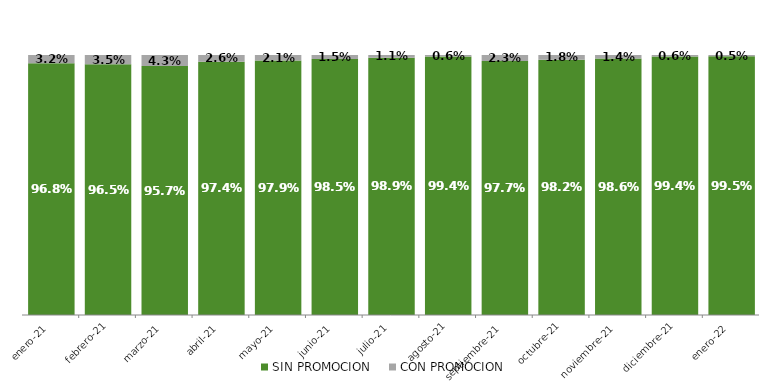
| Category | SIN PROMOCION   | CON PROMOCION   |
|---|---|---|
| 2021-01-01 | 0.968 | 0.032 |
| 2021-02-01 | 0.965 | 0.035 |
| 2021-03-01 | 0.957 | 0.043 |
| 2021-04-01 | 0.974 | 0.026 |
| 2021-05-01 | 0.979 | 0.021 |
| 2021-06-01 | 0.985 | 0.015 |
| 2021-07-01 | 0.989 | 0.011 |
| 2021-08-01 | 0.994 | 0.006 |
| 2021-09-01 | 0.977 | 0.023 |
| 2021-10-01 | 0.982 | 0.018 |
| 2021-11-01 | 0.986 | 0.014 |
| 2021-12-01 | 0.994 | 0.006 |
| 2022-01-01 | 0.995 | 0.005 |